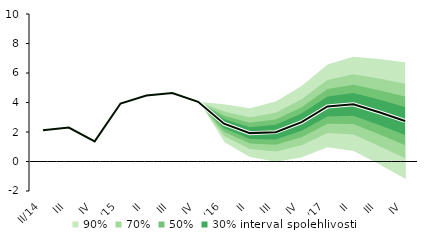
| Category | linka | Centerline |
|---|---|---|
| II/14 | 2.118 | 2.118 |
| III | 2.303 | 2.303 |
| IV | 1.363 | 1.363 |
| I/15 | 3.934 | 3.934 |
| II | 4.472 | 4.472 |
| III | 4.638 | 4.638 |
| IV | 4.05 | 4.05 |
| I/16 | 2.561 | 2.561 |
| II | 1.924 | 1.924 |
| III | 1.991 | 1.991 |
| IV | 2.663 | 2.663 |
| I/17 | 3.732 | 3.732 |
| II | 3.874 | 3.874 |
| III | 3.339 | 3.339 |
| IV | 2.748 | 2.748 |